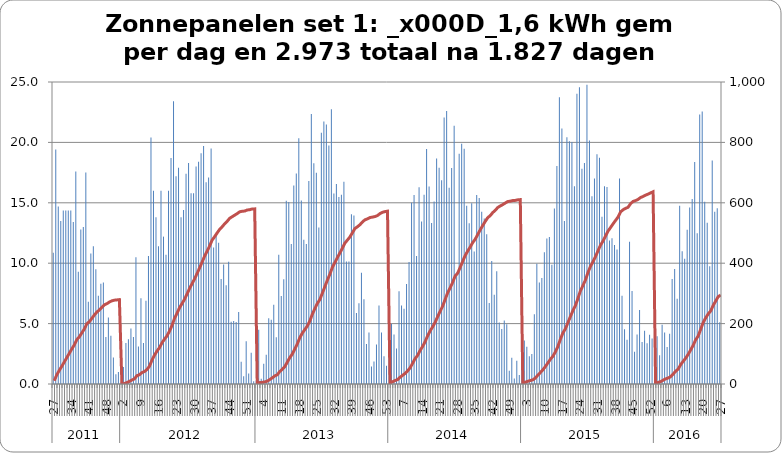
| Category | Som van kWh |
|---|---|
| 0 | 10.87 |
| 1 | 19.41 |
| 2 | 14.7 |
| 3 | 13.502 |
| 4 | 14.354 |
| 5 | 14.354 |
| 6 | 14.354 |
| 7 | 14.354 |
| 8 | 13.402 |
| 9 | 17.6 |
| 10 | 9.3 |
| 11 | 12.8 |
| 12 | 13 |
| 13 | 17.5 |
| 14 | 6.8 |
| 15 | 10.8 |
| 16 | 11.4 |
| 17 | 9.5 |
| 18 | 7.3 |
| 19 | 8.3 |
| 20 | 8.4 |
| 21 | 3.9 |
| 22 | 5.5 |
| 23 | 4 |
| 24 | 2.2 |
| 25 | 0.8 |
| 26 | 1 |
| 27 | 0.1 |
| 28 | 1.4 |
| 29 | 3.4 |
| 30 | 3.7 |
| 31 | 4.6 |
| 32 | 3.9 |
| 33 | 10.5 |
| 34 | 3.1 |
| 35 | 7.1 |
| 36 | 3.4 |
| 37 | 6.9 |
| 38 | 10.6 |
| 39 | 20.4 |
| 40 | 16 |
| 41 | 13.8 |
| 42 | 11.4 |
| 43 | 16 |
| 44 | 12.2 |
| 45 | 10.7 |
| 46 | 16 |
| 47 | 18.7 |
| 48 | 23.4 |
| 49 | 17.2 |
| 50 | 17.9 |
| 51 | 13.8 |
| 52 | 14.4 |
| 53 | 17.4 |
| 54 | 18.3 |
| 55 | 15.8 |
| 56 | 15.793 |
| 57 | 18.013 |
| 58 | 18.393 |
| 59 | 19.1 |
| 60 | 19.7 |
| 61 | 16.7 |
| 62 | 17.1 |
| 63 | 19.5 |
| 64 | 11.3 |
| 65 | 12.4 |
| 66 | 11.7 |
| 67 | 8.7 |
| 68 | 9.9 |
| 69 | 8.17 |
| 70 | 10.13 |
| 71 | 5.16 |
| 72 | 5.21 |
| 73 | 5.14 |
| 74 | 5.96 |
| 75 | 1.84 |
| 76 | 0.65 |
| 77 | 3.54 |
| 78 | 0.86 |
| 79 | 2.59 |
| 80 | 0.22 |
| 81 | 0.3 |
| 82 | 4.5 |
| 83 | 0.43 |
| 84 | 1.68 |
| 85 | 2.43 |
| 86 | 5.44 |
| 87 | 5.31 |
| 88 | 6.56 |
| 89 | 3.88 |
| 90 | 10.7 |
| 91 | 7.29 |
| 92 | 8.67 |
| 93 | 15.17 |
| 94 | 15.06 |
| 95 | 11.58 |
| 96 | 16.44 |
| 97 | 17.43 |
| 98 | 20.34 |
| 99 | 15.19 |
| 100 | 11.94 |
| 101 | 11.59 |
| 102 | 16.8 |
| 103 | 22.36 |
| 104 | 18.28 |
| 105 | 17.48 |
| 106 | 12.96 |
| 107 | 20.79 |
| 108 | 21.73 |
| 109 | 21.48 |
| 110 | 19.74 |
| 111 | 22.74 |
| 112 | 15.78 |
| 113 | 16.55 |
| 114 | 15.48 |
| 115 | 15.66 |
| 116 | 16.75 |
| 117 | 10.14 |
| 118 | 10.15 |
| 119 | 14.05 |
| 120 | 13.94 |
| 121 | 5.88 |
| 122 | 6.69 |
| 123 | 9.2 |
| 124 | 7.02 |
| 125 | 3.31 |
| 126 | 4.27 |
| 127 | 1.44 |
| 128 | 1.87 |
| 129 | 3.26 |
| 130 | 6.5 |
| 131 | 4.27 |
| 132 | 2.29 |
| 133 | 1.51 |
| 134 | 2.44 |
| 135 | 4.97 |
| 136 | 4.09 |
| 137 | 2.94 |
| 138 | 7.68 |
| 139 | 6.49 |
| 140 | 6.234 |
| 141 | 8.27 |
| 142 | 10.09 |
| 143 | 15.01 |
| 144 | 15.64 |
| 145 | 10.59 |
| 146 | 16.29 |
| 147 | 13.46 |
| 148 | 15.67 |
| 149 | 19.46 |
| 150 | 16.34 |
| 151 | 13.32 |
| 152 | 15.11 |
| 153 | 18.67 |
| 154 | 17.91 |
| 155 | 16.86 |
| 156 | 22.07 |
| 157 | 22.6 |
| 158 | 16.24 |
| 159 | 17.88 |
| 160 | 21.37 |
| 161 | 9.22 |
| 162 | 19.07 |
| 163 | 19.88 |
| 164 | 19.48 |
| 165 | 14.76 |
| 166 | 13.31 |
| 167 | 14.97 |
| 168 | 10.97 |
| 169 | 15.64 |
| 170 | 15.4 |
| 171 | 14.25 |
| 172 | 13.7 |
| 173 | 12.39 |
| 174 | 6.71 |
| 175 | 10.19 |
| 176 | 7.39 |
| 177 | 9.34 |
| 178 | 5.09 |
| 179 | 4.55 |
| 180 | 5.26 |
| 181 | 4.94 |
| 182 | 1.1 |
| 183 | 2.17 |
| 184 | 0.45 |
| 185 | 1.93 |
| 186 | 0.74 |
| 187 | 2.35 |
| 188 | 3.6 |
| 189 | 3.09 |
| 190 | 2.3 |
| 191 | 2.48 |
| 192 | 5.77 |
| 193 | 9.95 |
| 194 | 8.41 |
| 195 | 8.78 |
| 196 | 10.91 |
| 197 | 12.04 |
| 198 | 12.16 |
| 199 | 9.88 |
| 200 | 14.52 |
| 201 | 18.05 |
| 202 | 23.74 |
| 203 | 21.15 |
| 204 | 13.5 |
| 205 | 20.43 |
| 206 | 20.1 |
| 207 | 20.03 |
| 208 | 16.37 |
| 209 | 24.02 |
| 210 | 24.57 |
| 211 | 17.81 |
| 212 | 18.29 |
| 213 | 24.77 |
| 214 | 20.15 |
| 215 | 15.55 |
| 216 | 17.01 |
| 217 | 19.01 |
| 218 | 18.72 |
| 219 | 13.85 |
| 220 | 16.38 |
| 221 | 16.3 |
| 222 | 11.88 |
| 223 | 12.06 |
| 224 | 11.51 |
| 225 | 11.14 |
| 226 | 17.008 |
| 227 | 7.3 |
| 228 | 4.53 |
| 229 | 3.67 |
| 230 | 11.77 |
| 231 | 7.7 |
| 232 | 2.66 |
| 233 | 4.1 |
| 234 | 6.13 |
| 235 | 3.47 |
| 236 | 4.4 |
| 237 | 3.37 |
| 238 | 4.07 |
| 239 | 3.77 |
| 240 | 1.38 |
| 241 | 3.95 |
| 242 | 2.37 |
| 243 | 4.91 |
| 244 | 4.26 |
| 245 | 3.06 |
| 246 | 4.15 |
| 247 | 8.7 |
| 248 | 9.52 |
| 249 | 7.05 |
| 250 | 14.76 |
| 251 | 10.98 |
| 252 | 10.36 |
| 253 | 12.77 |
| 254 | 14.61 |
| 255 | 15.31 |
| 256 | 18.38 |
| 257 | 12.47 |
| 258 | 22.3 |
| 259 | 22.55 |
| 260 | 15.09 |
| 261 | 13.34 |
| 262 | 9.75 |
| 263 | 18.5 |
| 264 | 14.26 |
| 265 | 14.54 |
| 266 | 5.11 |